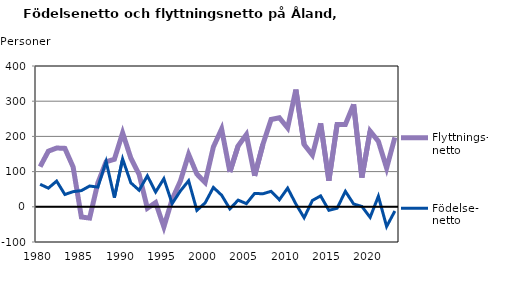
| Category | Flyttnings- netto | Födelse- netto |
|---|---|---|
| 1980.0 | 114 | 64 |
| 1981.0 | 158 | 53 |
| 1982.0 | 167 | 73 |
| 1983.0 | 166 | 35 |
| 1984.0 | 113 | 43 |
| 1985.0 | -29 | 46 |
| 1986.0 | -32 | 59 |
| 1987.0 | 68 | 56 |
| 1988.0 | 128 | 129 |
| 1989.0 | 135 | 26 |
| 1990.0 | 210 | 136 |
| 1991.0 | 138 | 68 |
| 1992.0 | 92 | 47 |
| 1993.0 | -4 | 88 |
| 1994.0 | 12 | 42 |
| 1995.0 | -57 | 80 |
| 1996.0 | 21 | 9 |
| 1997.0 | 73 | 45 |
| 1998.0 | 149 | 74 |
| 1999.0 | 93 | -10 |
| 2000.0 | 69 | 11 |
| 2001.0 | 170 | 55 |
| 2002.0 | 221 | 33 |
| 2003.0 | 99 | -6 |
| 2004.0 | 173 | 19 |
| 2005.0 | 205 | 9 |
| 2006.0 | 88 | 38 |
| 2007.0 | 177 | 37 |
| 2008.0 | 248 | 44 |
| 2009.0 | 253 | 20 |
| 2010.0 | 224 | 53 |
| 2011.0 | 333 | 8 |
| 2012.0 | 177 | -31 |
| 2013.0 | 147 | 18 |
| 2014.0 | 237 | 31 |
| 2015.0 | 74 | -10 |
| 2016.0 | 234 | -4 |
| 2017.0 | 234 | 44 |
| 2018.0 | 291 | 8 |
| 2019.0 | 83 | 1 |
| 2020.0 | 215 | -30 |
| 2021.0 | 186 | 30 |
| 2022.0 | 110 | -56 |
| 2023.0 | 197 | -12 |